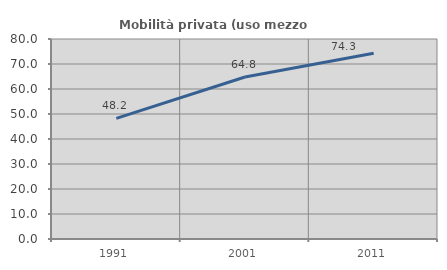
| Category | Mobilità privata (uso mezzo privato) |
|---|---|
| 1991.0 | 48.247 |
| 2001.0 | 64.784 |
| 2011.0 | 74.3 |